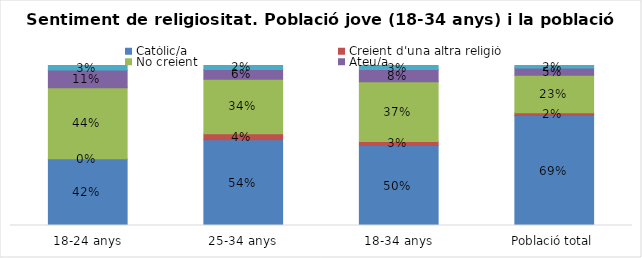
| Category | Catòlic/a | Creient d'una altra religió | No creient | Ateu/a | N.C. |
|---|---|---|---|---|---|
| 18-24 anys | 0.417 | 0 | 0.444 | 0.111 | 0.028 |
| 25-34 anys | 0.537 | 0.037 | 0.341 | 0.061 | 0.024 |
| 18-34 anys | 0.5 | 0.025 | 0.373 | 0.076 | 0.025 |
| Població total | 0.687 | 0.018 | 0.234 | 0.046 | 0.015 |